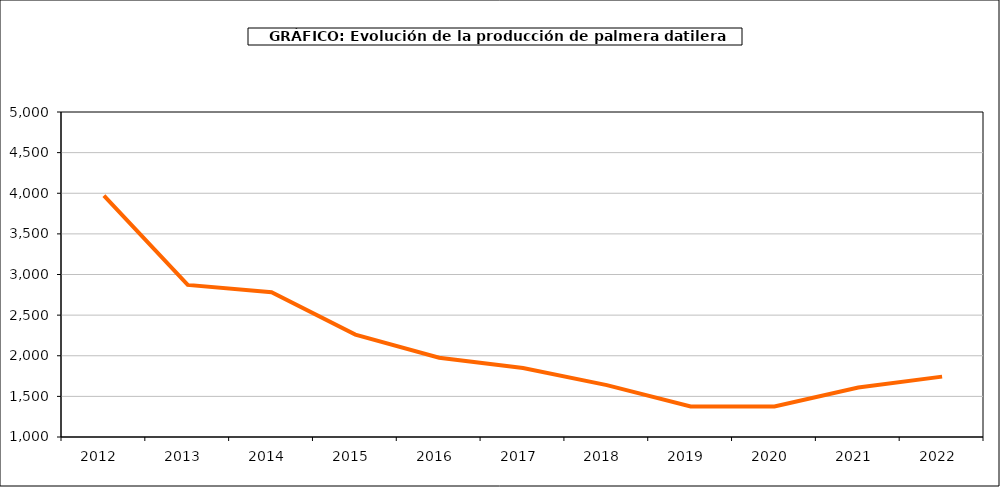
| Category | producción kiwi |
|---|---|
| 2012.0 | 3972 |
| 2013.0 | 2872 |
| 2014.0 | 2781 |
| 2015.0 | 2260 |
| 2016.0 | 1975 |
| 2017.0 | 1848 |
| 2018.0 | 1638 |
| 2019.0 | 1375 |
| 2020.0 | 1375 |
| 2021.0 | 1609 |
| 2022.0 | 1743 |